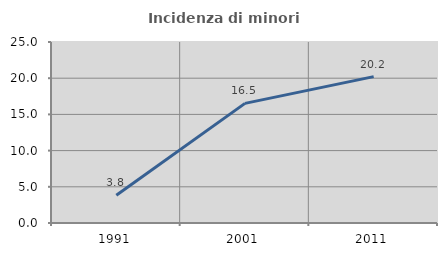
| Category | Incidenza di minori stranieri |
|---|---|
| 1991.0 | 3.846 |
| 2001.0 | 16.522 |
| 2011.0 | 20.216 |